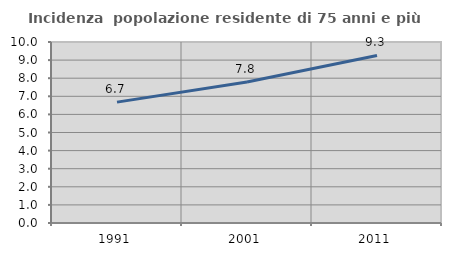
| Category | Incidenza  popolazione residente di 75 anni e più |
|---|---|
| 1991.0 | 6.679 |
| 2001.0 | 7.792 |
| 2011.0 | 9.259 |